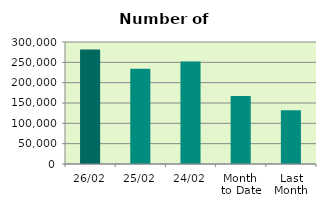
| Category | Series 0 |
|---|---|
| 26/02 | 281378 |
| 25/02 | 234458 |
| 24/02 | 252228 |
| Month 
to Date | 167076 |
| Last
Month | 132423.636 |